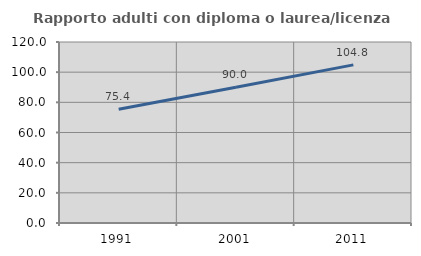
| Category | Rapporto adulti con diploma o laurea/licenza media  |
|---|---|
| 1991.0 | 75.419 |
| 2001.0 | 90.049 |
| 2011.0 | 104.831 |